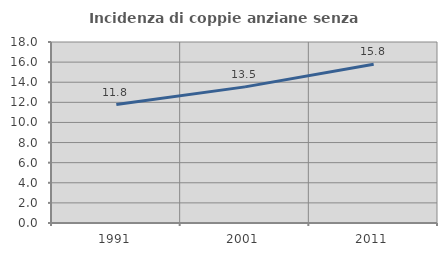
| Category | Incidenza di coppie anziane senza figli  |
|---|---|
| 1991.0 | 11.781 |
| 2001.0 | 13.536 |
| 2011.0 | 15.789 |